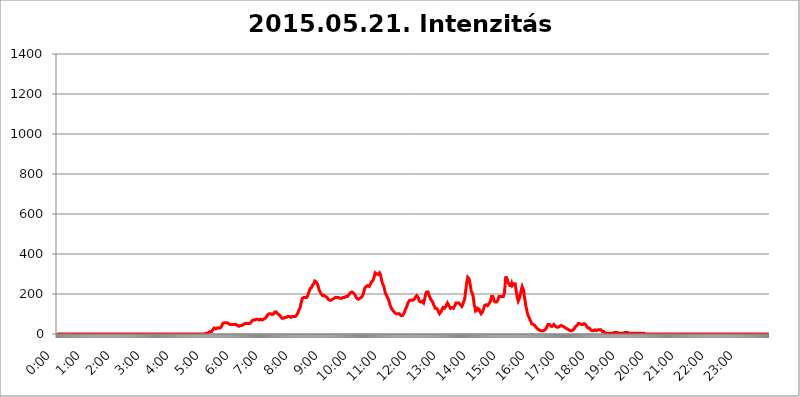
| Category | 2015.05.21. Intenzitás [W/m^2] |
|---|---|
| 0.0 | 0 |
| 0.0006944444444444445 | 0 |
| 0.001388888888888889 | 0 |
| 0.0020833333333333333 | 0 |
| 0.002777777777777778 | 0 |
| 0.003472222222222222 | 0 |
| 0.004166666666666667 | 0 |
| 0.004861111111111111 | 0 |
| 0.005555555555555556 | 0 |
| 0.0062499999999999995 | 0 |
| 0.006944444444444444 | 0 |
| 0.007638888888888889 | 0 |
| 0.008333333333333333 | 0 |
| 0.009027777777777779 | 0 |
| 0.009722222222222222 | 0 |
| 0.010416666666666666 | 0 |
| 0.011111111111111112 | 0 |
| 0.011805555555555555 | 0 |
| 0.012499999999999999 | 0 |
| 0.013194444444444444 | 0 |
| 0.013888888888888888 | 0 |
| 0.014583333333333332 | 0 |
| 0.015277777777777777 | 0 |
| 0.015972222222222224 | 0 |
| 0.016666666666666666 | 0 |
| 0.017361111111111112 | 0 |
| 0.018055555555555557 | 0 |
| 0.01875 | 0 |
| 0.019444444444444445 | 0 |
| 0.02013888888888889 | 0 |
| 0.020833333333333332 | 0 |
| 0.02152777777777778 | 0 |
| 0.022222222222222223 | 0 |
| 0.02291666666666667 | 0 |
| 0.02361111111111111 | 0 |
| 0.024305555555555556 | 0 |
| 0.024999999999999998 | 0 |
| 0.025694444444444447 | 0 |
| 0.02638888888888889 | 0 |
| 0.027083333333333334 | 0 |
| 0.027777777777777776 | 0 |
| 0.02847222222222222 | 0 |
| 0.029166666666666664 | 0 |
| 0.029861111111111113 | 0 |
| 0.030555555555555555 | 0 |
| 0.03125 | 0 |
| 0.03194444444444445 | 0 |
| 0.03263888888888889 | 0 |
| 0.03333333333333333 | 0 |
| 0.034027777777777775 | 0 |
| 0.034722222222222224 | 0 |
| 0.035416666666666666 | 0 |
| 0.036111111111111115 | 0 |
| 0.03680555555555556 | 0 |
| 0.0375 | 0 |
| 0.03819444444444444 | 0 |
| 0.03888888888888889 | 0 |
| 0.03958333333333333 | 0 |
| 0.04027777777777778 | 0 |
| 0.04097222222222222 | 0 |
| 0.041666666666666664 | 0 |
| 0.042361111111111106 | 0 |
| 0.04305555555555556 | 0 |
| 0.043750000000000004 | 0 |
| 0.044444444444444446 | 0 |
| 0.04513888888888889 | 0 |
| 0.04583333333333334 | 0 |
| 0.04652777777777778 | 0 |
| 0.04722222222222222 | 0 |
| 0.04791666666666666 | 0 |
| 0.04861111111111111 | 0 |
| 0.049305555555555554 | 0 |
| 0.049999999999999996 | 0 |
| 0.05069444444444445 | 0 |
| 0.051388888888888894 | 0 |
| 0.052083333333333336 | 0 |
| 0.05277777777777778 | 0 |
| 0.05347222222222222 | 0 |
| 0.05416666666666667 | 0 |
| 0.05486111111111111 | 0 |
| 0.05555555555555555 | 0 |
| 0.05625 | 0 |
| 0.05694444444444444 | 0 |
| 0.057638888888888885 | 0 |
| 0.05833333333333333 | 0 |
| 0.05902777777777778 | 0 |
| 0.059722222222222225 | 0 |
| 0.06041666666666667 | 0 |
| 0.061111111111111116 | 0 |
| 0.06180555555555556 | 0 |
| 0.0625 | 0 |
| 0.06319444444444444 | 0 |
| 0.06388888888888888 | 0 |
| 0.06458333333333334 | 0 |
| 0.06527777777777778 | 0 |
| 0.06597222222222222 | 0 |
| 0.06666666666666667 | 0 |
| 0.06736111111111111 | 0 |
| 0.06805555555555555 | 0 |
| 0.06874999999999999 | 0 |
| 0.06944444444444443 | 0 |
| 0.07013888888888889 | 0 |
| 0.07083333333333333 | 0 |
| 0.07152777777777779 | 0 |
| 0.07222222222222223 | 0 |
| 0.07291666666666667 | 0 |
| 0.07361111111111111 | 0 |
| 0.07430555555555556 | 0 |
| 0.075 | 0 |
| 0.07569444444444444 | 0 |
| 0.0763888888888889 | 0 |
| 0.07708333333333334 | 0 |
| 0.07777777777777778 | 0 |
| 0.07847222222222222 | 0 |
| 0.07916666666666666 | 0 |
| 0.0798611111111111 | 0 |
| 0.08055555555555556 | 0 |
| 0.08125 | 0 |
| 0.08194444444444444 | 0 |
| 0.08263888888888889 | 0 |
| 0.08333333333333333 | 0 |
| 0.08402777777777777 | 0 |
| 0.08472222222222221 | 0 |
| 0.08541666666666665 | 0 |
| 0.08611111111111112 | 0 |
| 0.08680555555555557 | 0 |
| 0.08750000000000001 | 0 |
| 0.08819444444444445 | 0 |
| 0.08888888888888889 | 0 |
| 0.08958333333333333 | 0 |
| 0.09027777777777778 | 0 |
| 0.09097222222222222 | 0 |
| 0.09166666666666667 | 0 |
| 0.09236111111111112 | 0 |
| 0.09305555555555556 | 0 |
| 0.09375 | 0 |
| 0.09444444444444444 | 0 |
| 0.09513888888888888 | 0 |
| 0.09583333333333333 | 0 |
| 0.09652777777777777 | 0 |
| 0.09722222222222222 | 0 |
| 0.09791666666666667 | 0 |
| 0.09861111111111111 | 0 |
| 0.09930555555555555 | 0 |
| 0.09999999999999999 | 0 |
| 0.10069444444444443 | 0 |
| 0.1013888888888889 | 0 |
| 0.10208333333333335 | 0 |
| 0.10277777777777779 | 0 |
| 0.10347222222222223 | 0 |
| 0.10416666666666667 | 0 |
| 0.10486111111111111 | 0 |
| 0.10555555555555556 | 0 |
| 0.10625 | 0 |
| 0.10694444444444444 | 0 |
| 0.1076388888888889 | 0 |
| 0.10833333333333334 | 0 |
| 0.10902777777777778 | 0 |
| 0.10972222222222222 | 0 |
| 0.1111111111111111 | 0 |
| 0.11180555555555556 | 0 |
| 0.11180555555555556 | 0 |
| 0.1125 | 0 |
| 0.11319444444444444 | 0 |
| 0.11388888888888889 | 0 |
| 0.11458333333333333 | 0 |
| 0.11527777777777777 | 0 |
| 0.11597222222222221 | 0 |
| 0.11666666666666665 | 0 |
| 0.1173611111111111 | 0 |
| 0.11805555555555557 | 0 |
| 0.11944444444444445 | 0 |
| 0.12013888888888889 | 0 |
| 0.12083333333333333 | 0 |
| 0.12152777777777778 | 0 |
| 0.12222222222222223 | 0 |
| 0.12291666666666667 | 0 |
| 0.12291666666666667 | 0 |
| 0.12361111111111112 | 0 |
| 0.12430555555555556 | 0 |
| 0.125 | 0 |
| 0.12569444444444444 | 0 |
| 0.12638888888888888 | 0 |
| 0.12708333333333333 | 0 |
| 0.16875 | 0 |
| 0.12847222222222224 | 0 |
| 0.12916666666666668 | 0 |
| 0.12986111111111112 | 0 |
| 0.13055555555555556 | 0 |
| 0.13125 | 0 |
| 0.13194444444444445 | 0 |
| 0.1326388888888889 | 0 |
| 0.13333333333333333 | 0 |
| 0.13402777777777777 | 0 |
| 0.13402777777777777 | 0 |
| 0.13472222222222222 | 0 |
| 0.13541666666666666 | 0 |
| 0.1361111111111111 | 0 |
| 0.13749999999999998 | 0 |
| 0.13819444444444443 | 0 |
| 0.1388888888888889 | 0 |
| 0.13958333333333334 | 0 |
| 0.14027777777777778 | 0 |
| 0.14097222222222222 | 0 |
| 0.14166666666666666 | 0 |
| 0.1423611111111111 | 0 |
| 0.14305555555555557 | 0 |
| 0.14375000000000002 | 0 |
| 0.14444444444444446 | 0 |
| 0.1451388888888889 | 0 |
| 0.1451388888888889 | 0 |
| 0.14652777777777778 | 0 |
| 0.14722222222222223 | 0 |
| 0.14791666666666667 | 0 |
| 0.1486111111111111 | 0 |
| 0.14930555555555555 | 0 |
| 0.15 | 0 |
| 0.15069444444444444 | 0 |
| 0.15138888888888888 | 0 |
| 0.15208333333333332 | 0 |
| 0.15277777777777776 | 0 |
| 0.15347222222222223 | 0 |
| 0.15416666666666667 | 0 |
| 0.15486111111111112 | 0 |
| 0.15555555555555556 | 0 |
| 0.15625 | 0 |
| 0.15694444444444444 | 0 |
| 0.15763888888888888 | 0 |
| 0.15833333333333333 | 0 |
| 0.15902777777777777 | 0 |
| 0.15972222222222224 | 0 |
| 0.16041666666666668 | 0 |
| 0.16111111111111112 | 0 |
| 0.16180555555555556 | 0 |
| 0.1625 | 0 |
| 0.16319444444444445 | 0 |
| 0.1638888888888889 | 0 |
| 0.16458333333333333 | 0 |
| 0.16527777777777777 | 0 |
| 0.16597222222222222 | 0 |
| 0.16666666666666666 | 0 |
| 0.1673611111111111 | 0 |
| 0.16805555555555554 | 0 |
| 0.16874999999999998 | 0 |
| 0.16944444444444443 | 0 |
| 0.17013888888888887 | 0 |
| 0.1708333333333333 | 0 |
| 0.17152777777777775 | 0 |
| 0.17222222222222225 | 0 |
| 0.1729166666666667 | 0 |
| 0.17361111111111113 | 0 |
| 0.17430555555555557 | 0 |
| 0.17500000000000002 | 0 |
| 0.17569444444444446 | 0 |
| 0.1763888888888889 | 0 |
| 0.17708333333333334 | 0 |
| 0.17777777777777778 | 0 |
| 0.17847222222222223 | 0 |
| 0.17916666666666667 | 0 |
| 0.1798611111111111 | 0 |
| 0.18055555555555555 | 0 |
| 0.18125 | 0 |
| 0.18194444444444444 | 0 |
| 0.1826388888888889 | 0 |
| 0.18333333333333335 | 0 |
| 0.1840277777777778 | 0 |
| 0.18472222222222223 | 0 |
| 0.18541666666666667 | 0 |
| 0.18611111111111112 | 0 |
| 0.18680555555555556 | 0 |
| 0.1875 | 0 |
| 0.18819444444444444 | 0 |
| 0.18888888888888888 | 0 |
| 0.18958333333333333 | 0 |
| 0.19027777777777777 | 0 |
| 0.1909722222222222 | 0 |
| 0.19166666666666665 | 0 |
| 0.19236111111111112 | 0 |
| 0.19305555555555554 | 0 |
| 0.19375 | 0 |
| 0.19444444444444445 | 0 |
| 0.1951388888888889 | 0 |
| 0.19583333333333333 | 0 |
| 0.19652777777777777 | 0 |
| 0.19722222222222222 | 0 |
| 0.19791666666666666 | 0 |
| 0.1986111111111111 | 0 |
| 0.19930555555555554 | 0 |
| 0.19999999999999998 | 0 |
| 0.20069444444444443 | 0 |
| 0.20138888888888887 | 0 |
| 0.2020833333333333 | 0 |
| 0.2027777777777778 | 0 |
| 0.2034722222222222 | 0 |
| 0.2041666666666667 | 0 |
| 0.20486111111111113 | 0 |
| 0.20555555555555557 | 0 |
| 0.20625000000000002 | 0 |
| 0.20694444444444446 | 0 |
| 0.2076388888888889 | 0 |
| 0.20833333333333334 | 3.525 |
| 0.20902777777777778 | 3.525 |
| 0.20972222222222223 | 3.525 |
| 0.21041666666666667 | 3.525 |
| 0.2111111111111111 | 3.525 |
| 0.21180555555555555 | 3.525 |
| 0.2125 | 7.887 |
| 0.21319444444444444 | 7.887 |
| 0.2138888888888889 | 7.887 |
| 0.21458333333333335 | 12.257 |
| 0.2152777777777778 | 12.257 |
| 0.21597222222222223 | 12.257 |
| 0.21666666666666667 | 12.257 |
| 0.21736111111111112 | 16.636 |
| 0.21805555555555556 | 21.024 |
| 0.21875 | 21.024 |
| 0.21944444444444444 | 25.419 |
| 0.22013888888888888 | 29.823 |
| 0.22083333333333333 | 29.823 |
| 0.22152777777777777 | 29.823 |
| 0.2222222222222222 | 25.419 |
| 0.22291666666666665 | 25.419 |
| 0.2236111111111111 | 25.419 |
| 0.22430555555555556 | 29.823 |
| 0.225 | 29.823 |
| 0.22569444444444445 | 29.823 |
| 0.2263888888888889 | 29.823 |
| 0.22708333333333333 | 29.823 |
| 0.22777777777777777 | 29.823 |
| 0.22847222222222222 | 29.823 |
| 0.22916666666666666 | 29.823 |
| 0.2298611111111111 | 34.234 |
| 0.23055555555555554 | 38.653 |
| 0.23124999999999998 | 43.079 |
| 0.23194444444444443 | 51.951 |
| 0.23263888888888887 | 56.398 |
| 0.2333333333333333 | 56.398 |
| 0.2340277777777778 | 56.398 |
| 0.2347222222222222 | 56.398 |
| 0.2354166666666667 | 56.398 |
| 0.23611111111111113 | 56.398 |
| 0.23680555555555557 | 60.85 |
| 0.23750000000000002 | 60.85 |
| 0.23819444444444446 | 56.398 |
| 0.2388888888888889 | 56.398 |
| 0.23958333333333334 | 56.398 |
| 0.24027777777777778 | 51.951 |
| 0.24097222222222223 | 47.511 |
| 0.24166666666666667 | 47.511 |
| 0.2423611111111111 | 47.511 |
| 0.24305555555555555 | 47.511 |
| 0.24375 | 47.511 |
| 0.24444444444444446 | 47.511 |
| 0.24513888888888888 | 47.511 |
| 0.24583333333333335 | 47.511 |
| 0.2465277777777778 | 47.511 |
| 0.24722222222222223 | 47.511 |
| 0.24791666666666667 | 47.511 |
| 0.24861111111111112 | 47.511 |
| 0.24930555555555556 | 47.511 |
| 0.25 | 47.511 |
| 0.25069444444444444 | 47.511 |
| 0.2513888888888889 | 47.511 |
| 0.2520833333333333 | 43.079 |
| 0.25277777777777777 | 43.079 |
| 0.2534722222222222 | 43.079 |
| 0.25416666666666665 | 43.079 |
| 0.2548611111111111 | 38.653 |
| 0.2555555555555556 | 38.653 |
| 0.25625000000000003 | 43.079 |
| 0.2569444444444445 | 43.079 |
| 0.2576388888888889 | 43.079 |
| 0.25833333333333336 | 43.079 |
| 0.2590277777777778 | 43.079 |
| 0.25972222222222224 | 47.511 |
| 0.2604166666666667 | 47.511 |
| 0.2611111111111111 | 47.511 |
| 0.26180555555555557 | 51.951 |
| 0.2625 | 51.951 |
| 0.26319444444444445 | 51.951 |
| 0.2638888888888889 | 51.951 |
| 0.26458333333333334 | 51.951 |
| 0.2652777777777778 | 51.951 |
| 0.2659722222222222 | 51.951 |
| 0.26666666666666666 | 51.951 |
| 0.2673611111111111 | 51.951 |
| 0.26805555555555555 | 51.951 |
| 0.26875 | 51.951 |
| 0.26944444444444443 | 51.951 |
| 0.2701388888888889 | 51.951 |
| 0.2708333333333333 | 56.398 |
| 0.27152777777777776 | 56.398 |
| 0.2722222222222222 | 60.85 |
| 0.27291666666666664 | 65.31 |
| 0.2736111111111111 | 69.775 |
| 0.2743055555555555 | 69.775 |
| 0.27499999999999997 | 69.775 |
| 0.27569444444444446 | 69.775 |
| 0.27638888888888885 | 69.775 |
| 0.27708333333333335 | 69.775 |
| 0.2777777777777778 | 69.775 |
| 0.27847222222222223 | 74.246 |
| 0.2791666666666667 | 74.246 |
| 0.2798611111111111 | 74.246 |
| 0.28055555555555556 | 74.246 |
| 0.28125 | 74.246 |
| 0.28194444444444444 | 69.775 |
| 0.2826388888888889 | 69.775 |
| 0.2833333333333333 | 69.775 |
| 0.28402777777777777 | 69.775 |
| 0.2847222222222222 | 69.775 |
| 0.28541666666666665 | 74.246 |
| 0.28611111111111115 | 74.246 |
| 0.28680555555555554 | 74.246 |
| 0.28750000000000003 | 69.775 |
| 0.2881944444444445 | 69.775 |
| 0.2888888888888889 | 69.775 |
| 0.28958333333333336 | 74.246 |
| 0.2902777777777778 | 74.246 |
| 0.29097222222222224 | 78.722 |
| 0.2916666666666667 | 78.722 |
| 0.2923611111111111 | 78.722 |
| 0.29305555555555557 | 83.205 |
| 0.29375 | 87.692 |
| 0.29444444444444445 | 92.184 |
| 0.2951388888888889 | 96.682 |
| 0.29583333333333334 | 101.184 |
| 0.2965277777777778 | 101.184 |
| 0.2972222222222222 | 101.184 |
| 0.29791666666666666 | 101.184 |
| 0.2986111111111111 | 101.184 |
| 0.29930555555555555 | 101.184 |
| 0.3 | 101.184 |
| 0.30069444444444443 | 96.682 |
| 0.3013888888888889 | 96.682 |
| 0.3020833333333333 | 96.682 |
| 0.30277777777777776 | 101.184 |
| 0.3034722222222222 | 101.184 |
| 0.30416666666666664 | 105.69 |
| 0.3048611111111111 | 110.201 |
| 0.3055555555555555 | 110.201 |
| 0.30624999999999997 | 110.201 |
| 0.3069444444444444 | 110.201 |
| 0.3076388888888889 | 110.201 |
| 0.30833333333333335 | 105.69 |
| 0.3090277777777778 | 101.184 |
| 0.30972222222222223 | 101.184 |
| 0.3104166666666667 | 96.682 |
| 0.3111111111111111 | 96.682 |
| 0.31180555555555556 | 92.184 |
| 0.3125 | 92.184 |
| 0.31319444444444444 | 87.692 |
| 0.3138888888888889 | 87.692 |
| 0.3145833333333333 | 83.205 |
| 0.31527777777777777 | 78.722 |
| 0.3159722222222222 | 78.722 |
| 0.31666666666666665 | 78.722 |
| 0.31736111111111115 | 78.722 |
| 0.31805555555555554 | 83.205 |
| 0.31875000000000003 | 83.205 |
| 0.3194444444444445 | 83.205 |
| 0.3201388888888889 | 83.205 |
| 0.32083333333333336 | 83.205 |
| 0.3215277777777778 | 83.205 |
| 0.32222222222222224 | 83.205 |
| 0.3229166666666667 | 83.205 |
| 0.3236111111111111 | 87.692 |
| 0.32430555555555557 | 87.692 |
| 0.325 | 87.692 |
| 0.32569444444444445 | 87.692 |
| 0.3263888888888889 | 87.692 |
| 0.32708333333333334 | 83.205 |
| 0.3277777777777778 | 83.205 |
| 0.3284722222222222 | 83.205 |
| 0.32916666666666666 | 87.692 |
| 0.3298611111111111 | 87.692 |
| 0.33055555555555555 | 87.692 |
| 0.33125 | 87.692 |
| 0.33194444444444443 | 87.692 |
| 0.3326388888888889 | 83.205 |
| 0.3333333333333333 | 87.692 |
| 0.3340277777777778 | 87.692 |
| 0.3347222222222222 | 92.184 |
| 0.3354166666666667 | 92.184 |
| 0.3361111111111111 | 96.682 |
| 0.3368055555555556 | 101.184 |
| 0.33749999999999997 | 105.69 |
| 0.33819444444444446 | 110.201 |
| 0.33888888888888885 | 119.235 |
| 0.33958333333333335 | 123.758 |
| 0.34027777777777773 | 128.284 |
| 0.34097222222222223 | 137.347 |
| 0.3416666666666666 | 150.964 |
| 0.3423611111111111 | 160.056 |
| 0.3430555555555555 | 169.156 |
| 0.34375 | 178.264 |
| 0.3444444444444445 | 182.82 |
| 0.3451388888888889 | 182.82 |
| 0.3458333333333334 | 182.82 |
| 0.34652777777777777 | 182.82 |
| 0.34722222222222227 | 182.82 |
| 0.34791666666666665 | 182.82 |
| 0.34861111111111115 | 182.82 |
| 0.34930555555555554 | 178.264 |
| 0.35000000000000003 | 182.82 |
| 0.3506944444444444 | 182.82 |
| 0.3513888888888889 | 191.937 |
| 0.3520833333333333 | 201.058 |
| 0.3527777777777778 | 205.62 |
| 0.3534722222222222 | 214.746 |
| 0.3541666666666667 | 219.309 |
| 0.3548611111111111 | 228.436 |
| 0.35555555555555557 | 228.436 |
| 0.35625 | 233 |
| 0.35694444444444445 | 233 |
| 0.3576388888888889 | 242.127 |
| 0.35833333333333334 | 242.127 |
| 0.3590277777777778 | 246.689 |
| 0.3597222222222222 | 251.251 |
| 0.36041666666666666 | 255.813 |
| 0.3611111111111111 | 264.932 |
| 0.36180555555555555 | 264.932 |
| 0.3625 | 264.932 |
| 0.36319444444444443 | 260.373 |
| 0.3638888888888889 | 260.373 |
| 0.3645833333333333 | 255.813 |
| 0.3652777777777778 | 246.689 |
| 0.3659722222222222 | 237.564 |
| 0.3666666666666667 | 228.436 |
| 0.3673611111111111 | 219.309 |
| 0.3680555555555556 | 214.746 |
| 0.36874999999999997 | 210.182 |
| 0.36944444444444446 | 205.62 |
| 0.37013888888888885 | 201.058 |
| 0.37083333333333335 | 196.497 |
| 0.37152777777777773 | 196.497 |
| 0.37222222222222223 | 191.937 |
| 0.3729166666666666 | 191.937 |
| 0.3736111111111111 | 191.937 |
| 0.3743055555555555 | 191.937 |
| 0.375 | 191.937 |
| 0.3756944444444445 | 187.378 |
| 0.3763888888888889 | 187.378 |
| 0.3770833333333334 | 187.378 |
| 0.37777777777777777 | 182.82 |
| 0.37847222222222227 | 182.82 |
| 0.37916666666666665 | 178.264 |
| 0.37986111111111115 | 173.709 |
| 0.38055555555555554 | 173.709 |
| 0.38125000000000003 | 173.709 |
| 0.3819444444444444 | 169.156 |
| 0.3826388888888889 | 169.156 |
| 0.3833333333333333 | 169.156 |
| 0.3840277777777778 | 169.156 |
| 0.3847222222222222 | 169.156 |
| 0.3854166666666667 | 173.709 |
| 0.3861111111111111 | 173.709 |
| 0.38680555555555557 | 173.709 |
| 0.3875 | 178.264 |
| 0.38819444444444445 | 178.264 |
| 0.3888888888888889 | 182.82 |
| 0.38958333333333334 | 182.82 |
| 0.3902777777777778 | 182.82 |
| 0.3909722222222222 | 182.82 |
| 0.39166666666666666 | 182.82 |
| 0.3923611111111111 | 182.82 |
| 0.39305555555555555 | 182.82 |
| 0.39375 | 182.82 |
| 0.39444444444444443 | 182.82 |
| 0.3951388888888889 | 178.264 |
| 0.3958333333333333 | 178.264 |
| 0.3965277777777778 | 178.264 |
| 0.3972222222222222 | 178.264 |
| 0.3979166666666667 | 178.264 |
| 0.3986111111111111 | 178.264 |
| 0.3993055555555556 | 182.82 |
| 0.39999999999999997 | 182.82 |
| 0.40069444444444446 | 182.82 |
| 0.40138888888888885 | 182.82 |
| 0.40208333333333335 | 182.82 |
| 0.40277777777777773 | 182.82 |
| 0.40347222222222223 | 182.82 |
| 0.4041666666666666 | 182.82 |
| 0.4048611111111111 | 187.378 |
| 0.4055555555555555 | 187.378 |
| 0.40625 | 187.378 |
| 0.4069444444444445 | 187.378 |
| 0.4076388888888889 | 187.378 |
| 0.4083333333333334 | 191.937 |
| 0.40902777777777777 | 196.497 |
| 0.40972222222222227 | 201.058 |
| 0.41041666666666665 | 201.058 |
| 0.41111111111111115 | 205.62 |
| 0.41180555555555554 | 210.182 |
| 0.41250000000000003 | 210.182 |
| 0.4131944444444444 | 210.182 |
| 0.4138888888888889 | 210.182 |
| 0.4145833333333333 | 210.182 |
| 0.4152777777777778 | 205.62 |
| 0.4159722222222222 | 201.058 |
| 0.4166666666666667 | 201.058 |
| 0.4173611111111111 | 196.497 |
| 0.41805555555555557 | 191.937 |
| 0.41875 | 187.378 |
| 0.41944444444444445 | 182.82 |
| 0.4201388888888889 | 178.264 |
| 0.42083333333333334 | 173.709 |
| 0.4215277777777778 | 173.709 |
| 0.4222222222222222 | 173.709 |
| 0.42291666666666666 | 173.709 |
| 0.4236111111111111 | 178.264 |
| 0.42430555555555555 | 178.264 |
| 0.425 | 178.264 |
| 0.42569444444444443 | 178.264 |
| 0.4263888888888889 | 182.82 |
| 0.4270833333333333 | 182.82 |
| 0.4277777777777778 | 187.378 |
| 0.4284722222222222 | 191.937 |
| 0.4291666666666667 | 201.058 |
| 0.4298611111111111 | 210.182 |
| 0.4305555555555556 | 219.309 |
| 0.43124999999999997 | 228.436 |
| 0.43194444444444446 | 228.436 |
| 0.43263888888888885 | 233 |
| 0.43333333333333335 | 237.564 |
| 0.43402777777777773 | 242.127 |
| 0.43472222222222223 | 242.127 |
| 0.4354166666666666 | 242.127 |
| 0.4361111111111111 | 242.127 |
| 0.4368055555555555 | 237.564 |
| 0.4375 | 237.564 |
| 0.4381944444444445 | 242.127 |
| 0.4388888888888889 | 242.127 |
| 0.4395833333333334 | 251.251 |
| 0.44027777777777777 | 260.373 |
| 0.44097222222222227 | 264.932 |
| 0.44166666666666665 | 264.932 |
| 0.44236111111111115 | 264.932 |
| 0.44305555555555554 | 264.932 |
| 0.44375000000000003 | 269.49 |
| 0.4444444444444444 | 283.156 |
| 0.4451388888888889 | 296.808 |
| 0.4458333333333333 | 305.898 |
| 0.4465277777777778 | 310.44 |
| 0.4472222222222222 | 305.898 |
| 0.4479166666666667 | 301.354 |
| 0.4486111111111111 | 296.808 |
| 0.44930555555555557 | 296.808 |
| 0.45 | 296.808 |
| 0.45069444444444445 | 301.354 |
| 0.4513888888888889 | 301.354 |
| 0.45208333333333334 | 305.898 |
| 0.4527777777777778 | 301.354 |
| 0.4534722222222222 | 296.808 |
| 0.45416666666666666 | 283.156 |
| 0.4548611111111111 | 269.49 |
| 0.45555555555555555 | 260.373 |
| 0.45625 | 251.251 |
| 0.45694444444444443 | 246.689 |
| 0.4576388888888889 | 242.127 |
| 0.4583333333333333 | 233 |
| 0.4590277777777778 | 223.873 |
| 0.4597222222222222 | 210.182 |
| 0.4604166666666667 | 205.62 |
| 0.4611111111111111 | 196.497 |
| 0.4618055555555556 | 191.937 |
| 0.46249999999999997 | 187.378 |
| 0.46319444444444446 | 182.82 |
| 0.46388888888888885 | 178.264 |
| 0.46458333333333335 | 173.709 |
| 0.46527777777777773 | 164.605 |
| 0.46597222222222223 | 155.509 |
| 0.4666666666666666 | 146.423 |
| 0.4673611111111111 | 141.884 |
| 0.4680555555555555 | 132.814 |
| 0.46875 | 128.284 |
| 0.4694444444444445 | 123.758 |
| 0.4701388888888889 | 123.758 |
| 0.4708333333333334 | 119.235 |
| 0.47152777777777777 | 114.716 |
| 0.47222222222222227 | 114.716 |
| 0.47291666666666665 | 110.201 |
| 0.47361111111111115 | 105.69 |
| 0.47430555555555554 | 101.184 |
| 0.47500000000000003 | 101.184 |
| 0.4756944444444444 | 101.184 |
| 0.4763888888888889 | 96.682 |
| 0.4770833333333333 | 101.184 |
| 0.4777777777777778 | 101.184 |
| 0.4784722222222222 | 101.184 |
| 0.4791666666666667 | 101.184 |
| 0.4798611111111111 | 101.184 |
| 0.48055555555555557 | 96.682 |
| 0.48125 | 96.682 |
| 0.48194444444444445 | 92.184 |
| 0.4826388888888889 | 92.184 |
| 0.48333333333333334 | 92.184 |
| 0.4840277777777778 | 92.184 |
| 0.4847222222222222 | 96.682 |
| 0.48541666666666666 | 96.682 |
| 0.4861111111111111 | 101.184 |
| 0.48680555555555555 | 105.69 |
| 0.4875 | 114.716 |
| 0.48819444444444443 | 119.235 |
| 0.4888888888888889 | 128.284 |
| 0.4895833333333333 | 132.814 |
| 0.4902777777777778 | 137.347 |
| 0.4909722222222222 | 146.423 |
| 0.4916666666666667 | 150.964 |
| 0.4923611111111111 | 160.056 |
| 0.4930555555555556 | 164.605 |
| 0.49374999999999997 | 164.605 |
| 0.49444444444444446 | 169.156 |
| 0.49513888888888885 | 169.156 |
| 0.49583333333333335 | 169.156 |
| 0.49652777777777773 | 169.156 |
| 0.49722222222222223 | 169.156 |
| 0.4979166666666666 | 169.156 |
| 0.4986111111111111 | 169.156 |
| 0.4993055555555555 | 173.709 |
| 0.5 | 173.709 |
| 0.5006944444444444 | 173.709 |
| 0.5013888888888889 | 178.264 |
| 0.5020833333333333 | 182.82 |
| 0.5027777777777778 | 187.378 |
| 0.5034722222222222 | 187.378 |
| 0.5041666666666667 | 191.937 |
| 0.5048611111111111 | 191.937 |
| 0.5055555555555555 | 187.378 |
| 0.50625 | 182.82 |
| 0.5069444444444444 | 173.709 |
| 0.5076388888888889 | 164.605 |
| 0.5083333333333333 | 160.056 |
| 0.5090277777777777 | 160.056 |
| 0.5097222222222222 | 160.056 |
| 0.5104166666666666 | 160.056 |
| 0.5111111111111112 | 160.056 |
| 0.5118055555555555 | 164.605 |
| 0.5125000000000001 | 164.605 |
| 0.5131944444444444 | 160.056 |
| 0.513888888888889 | 155.509 |
| 0.5145833333333333 | 160.056 |
| 0.5152777777777778 | 173.709 |
| 0.5159722222222222 | 187.378 |
| 0.5166666666666667 | 201.058 |
| 0.517361111111111 | 205.62 |
| 0.5180555555555556 | 210.182 |
| 0.5187499999999999 | 214.746 |
| 0.5194444444444445 | 210.182 |
| 0.5201388888888888 | 210.182 |
| 0.5208333333333334 | 201.058 |
| 0.5215277777777778 | 191.937 |
| 0.5222222222222223 | 191.937 |
| 0.5229166666666667 | 182.82 |
| 0.5236111111111111 | 173.709 |
| 0.5243055555555556 | 169.156 |
| 0.525 | 169.156 |
| 0.5256944444444445 | 164.605 |
| 0.5263888888888889 | 160.056 |
| 0.5270833333333333 | 155.509 |
| 0.5277777777777778 | 146.423 |
| 0.5284722222222222 | 141.884 |
| 0.5291666666666667 | 137.347 |
| 0.5298611111111111 | 128.284 |
| 0.5305555555555556 | 128.284 |
| 0.53125 | 128.284 |
| 0.5319444444444444 | 128.284 |
| 0.5326388888888889 | 128.284 |
| 0.5333333333333333 | 123.758 |
| 0.5340277777777778 | 119.235 |
| 0.5347222222222222 | 110.201 |
| 0.5354166666666667 | 105.69 |
| 0.5361111111111111 | 101.184 |
| 0.5368055555555555 | 101.184 |
| 0.5375 | 101.184 |
| 0.5381944444444444 | 110.201 |
| 0.5388888888888889 | 114.716 |
| 0.5395833333333333 | 123.758 |
| 0.5402777777777777 | 128.284 |
| 0.5409722222222222 | 132.814 |
| 0.5416666666666666 | 132.814 |
| 0.5423611111111112 | 132.814 |
| 0.5430555555555555 | 128.284 |
| 0.5437500000000001 | 128.284 |
| 0.5444444444444444 | 132.814 |
| 0.545138888888889 | 137.347 |
| 0.5458333333333333 | 146.423 |
| 0.5465277777777778 | 150.964 |
| 0.5472222222222222 | 155.509 |
| 0.5479166666666667 | 155.509 |
| 0.548611111111111 | 146.423 |
| 0.5493055555555556 | 141.884 |
| 0.5499999999999999 | 137.347 |
| 0.5506944444444445 | 132.814 |
| 0.5513888888888888 | 128.284 |
| 0.5520833333333334 | 128.284 |
| 0.5527777777777778 | 132.814 |
| 0.5534722222222223 | 132.814 |
| 0.5541666666666667 | 132.814 |
| 0.5548611111111111 | 132.814 |
| 0.5555555555555556 | 128.284 |
| 0.55625 | 132.814 |
| 0.5569444444444445 | 137.347 |
| 0.5576388888888889 | 141.884 |
| 0.5583333333333333 | 146.423 |
| 0.5590277777777778 | 155.509 |
| 0.5597222222222222 | 155.509 |
| 0.5604166666666667 | 155.509 |
| 0.5611111111111111 | 155.509 |
| 0.5618055555555556 | 155.509 |
| 0.5625 | 155.509 |
| 0.5631944444444444 | 155.509 |
| 0.5638888888888889 | 150.964 |
| 0.5645833333333333 | 150.964 |
| 0.5652777777777778 | 146.423 |
| 0.5659722222222222 | 141.884 |
| 0.5666666666666667 | 141.884 |
| 0.5673611111111111 | 137.347 |
| 0.5680555555555555 | 141.884 |
| 0.56875 | 146.423 |
| 0.5694444444444444 | 155.509 |
| 0.5701388888888889 | 160.056 |
| 0.5708333333333333 | 169.156 |
| 0.5715277777777777 | 178.264 |
| 0.5722222222222222 | 196.497 |
| 0.5729166666666666 | 219.309 |
| 0.5736111111111112 | 237.564 |
| 0.5743055555555555 | 255.813 |
| 0.5750000000000001 | 269.49 |
| 0.5756944444444444 | 283.156 |
| 0.576388888888889 | 287.709 |
| 0.5770833333333333 | 283.156 |
| 0.5777777777777778 | 274.047 |
| 0.5784722222222222 | 260.373 |
| 0.5791666666666667 | 246.689 |
| 0.579861111111111 | 233 |
| 0.5805555555555556 | 214.746 |
| 0.5812499999999999 | 210.182 |
| 0.5819444444444445 | 205.62 |
| 0.5826388888888888 | 196.497 |
| 0.5833333333333334 | 187.378 |
| 0.5840277777777778 | 169.156 |
| 0.5847222222222223 | 146.423 |
| 0.5854166666666667 | 141.884 |
| 0.5861111111111111 | 128.284 |
| 0.5868055555555556 | 114.716 |
| 0.5875 | 110.201 |
| 0.5881944444444445 | 110.201 |
| 0.5888888888888889 | 119.235 |
| 0.5895833333333333 | 128.284 |
| 0.5902777777777778 | 128.284 |
| 0.5909722222222222 | 128.284 |
| 0.5916666666666667 | 123.758 |
| 0.5923611111111111 | 119.235 |
| 0.5930555555555556 | 110.201 |
| 0.59375 | 105.69 |
| 0.5944444444444444 | 101.184 |
| 0.5951388888888889 | 101.184 |
| 0.5958333333333333 | 105.69 |
| 0.5965277777777778 | 110.201 |
| 0.5972222222222222 | 119.235 |
| 0.5979166666666667 | 123.758 |
| 0.5986111111111111 | 132.814 |
| 0.5993055555555555 | 141.884 |
| 0.6 | 146.423 |
| 0.6006944444444444 | 146.423 |
| 0.6013888888888889 | 146.423 |
| 0.6020833333333333 | 146.423 |
| 0.6027777777777777 | 141.884 |
| 0.6034722222222222 | 141.884 |
| 0.6041666666666666 | 146.423 |
| 0.6048611111111112 | 146.423 |
| 0.6055555555555555 | 150.964 |
| 0.6062500000000001 | 150.964 |
| 0.6069444444444444 | 155.509 |
| 0.607638888888889 | 164.605 |
| 0.6083333333333333 | 173.709 |
| 0.6090277777777778 | 187.378 |
| 0.6097222222222222 | 191.937 |
| 0.6104166666666667 | 191.937 |
| 0.611111111111111 | 187.378 |
| 0.6118055555555556 | 178.264 |
| 0.6124999999999999 | 169.156 |
| 0.6131944444444445 | 164.605 |
| 0.6138888888888888 | 160.056 |
| 0.6145833333333334 | 160.056 |
| 0.6152777777777778 | 160.056 |
| 0.6159722222222223 | 160.056 |
| 0.6166666666666667 | 160.056 |
| 0.6173611111111111 | 164.605 |
| 0.6180555555555556 | 169.156 |
| 0.61875 | 178.264 |
| 0.6194444444444445 | 187.378 |
| 0.6201388888888889 | 187.378 |
| 0.6208333333333333 | 187.378 |
| 0.6215277777777778 | 187.378 |
| 0.6222222222222222 | 182.82 |
| 0.6229166666666667 | 182.82 |
| 0.6236111111111111 | 187.378 |
| 0.6243055555555556 | 187.378 |
| 0.625 | 187.378 |
| 0.6256944444444444 | 187.378 |
| 0.6263888888888889 | 191.937 |
| 0.6270833333333333 | 205.62 |
| 0.6277777777777778 | 228.436 |
| 0.6284722222222222 | 264.932 |
| 0.6291666666666667 | 287.709 |
| 0.6298611111111111 | 292.259 |
| 0.6305555555555555 | 283.156 |
| 0.63125 | 269.49 |
| 0.6319444444444444 | 255.813 |
| 0.6326388888888889 | 251.251 |
| 0.6333333333333333 | 251.251 |
| 0.6340277777777777 | 251.251 |
| 0.6347222222222222 | 242.127 |
| 0.6354166666666666 | 237.564 |
| 0.6361111111111112 | 237.564 |
| 0.6368055555555555 | 242.127 |
| 0.6375000000000001 | 251.251 |
| 0.6381944444444444 | 242.127 |
| 0.638888888888889 | 237.564 |
| 0.6395833333333333 | 242.127 |
| 0.6402777777777778 | 251.251 |
| 0.6409722222222222 | 255.813 |
| 0.6416666666666667 | 255.813 |
| 0.642361111111111 | 251.251 |
| 0.6430555555555556 | 233 |
| 0.6437499999999999 | 214.746 |
| 0.6444444444444445 | 196.497 |
| 0.6451388888888888 | 182.82 |
| 0.6458333333333334 | 173.709 |
| 0.6465277777777778 | 164.605 |
| 0.6472222222222223 | 164.605 |
| 0.6479166666666667 | 169.156 |
| 0.6486111111111111 | 182.82 |
| 0.6493055555555556 | 196.497 |
| 0.65 | 205.62 |
| 0.6506944444444445 | 219.309 |
| 0.6513888888888889 | 223.873 |
| 0.6520833333333333 | 237.564 |
| 0.6527777777777778 | 237.564 |
| 0.6534722222222222 | 233 |
| 0.6541666666666667 | 219.309 |
| 0.6548611111111111 | 196.497 |
| 0.6555555555555556 | 178.264 |
| 0.65625 | 164.605 |
| 0.6569444444444444 | 146.423 |
| 0.6576388888888889 | 132.814 |
| 0.6583333333333333 | 123.758 |
| 0.6590277777777778 | 110.201 |
| 0.6597222222222222 | 101.184 |
| 0.6604166666666667 | 92.184 |
| 0.6611111111111111 | 87.692 |
| 0.6618055555555555 | 83.205 |
| 0.6625 | 78.722 |
| 0.6631944444444444 | 69.775 |
| 0.6638888888888889 | 65.31 |
| 0.6645833333333333 | 60.85 |
| 0.6652777777777777 | 51.951 |
| 0.6659722222222222 | 47.511 |
| 0.6666666666666666 | 47.511 |
| 0.6673611111111111 | 47.511 |
| 0.6680555555555556 | 43.079 |
| 0.6687500000000001 | 43.079 |
| 0.6694444444444444 | 43.079 |
| 0.6701388888888888 | 38.653 |
| 0.6708333333333334 | 38.653 |
| 0.6715277777777778 | 34.234 |
| 0.6722222222222222 | 29.823 |
| 0.6729166666666666 | 29.823 |
| 0.6736111111111112 | 25.419 |
| 0.6743055555555556 | 25.419 |
| 0.6749999999999999 | 21.024 |
| 0.6756944444444444 | 21.024 |
| 0.6763888888888889 | 21.024 |
| 0.6770833333333334 | 21.024 |
| 0.6777777777777777 | 16.636 |
| 0.6784722222222223 | 16.636 |
| 0.6791666666666667 | 16.636 |
| 0.6798611111111111 | 16.636 |
| 0.6805555555555555 | 16.636 |
| 0.68125 | 16.636 |
| 0.6819444444444445 | 16.636 |
| 0.6826388888888889 | 16.636 |
| 0.6833333333333332 | 16.636 |
| 0.6840277777777778 | 21.024 |
| 0.6847222222222222 | 21.024 |
| 0.6854166666666667 | 25.419 |
| 0.686111111111111 | 29.823 |
| 0.6868055555555556 | 38.653 |
| 0.6875 | 43.079 |
| 0.6881944444444444 | 47.511 |
| 0.688888888888889 | 47.511 |
| 0.6895833333333333 | 47.511 |
| 0.6902777777777778 | 47.511 |
| 0.6909722222222222 | 47.511 |
| 0.6916666666666668 | 43.079 |
| 0.6923611111111111 | 38.653 |
| 0.6930555555555555 | 38.653 |
| 0.69375 | 38.653 |
| 0.6944444444444445 | 38.653 |
| 0.6951388888888889 | 38.653 |
| 0.6958333333333333 | 43.079 |
| 0.6965277777777777 | 47.511 |
| 0.6972222222222223 | 43.079 |
| 0.6979166666666666 | 43.079 |
| 0.6986111111111111 | 38.653 |
| 0.6993055555555556 | 38.653 |
| 0.7000000000000001 | 34.234 |
| 0.7006944444444444 | 34.234 |
| 0.7013888888888888 | 34.234 |
| 0.7020833333333334 | 34.234 |
| 0.7027777777777778 | 34.234 |
| 0.7034722222222222 | 34.234 |
| 0.7041666666666666 | 38.653 |
| 0.7048611111111112 | 38.653 |
| 0.7055555555555556 | 38.653 |
| 0.7062499999999999 | 38.653 |
| 0.7069444444444444 | 43.079 |
| 0.7076388888888889 | 43.079 |
| 0.7083333333333334 | 38.653 |
| 0.7090277777777777 | 38.653 |
| 0.7097222222222223 | 38.653 |
| 0.7104166666666667 | 38.653 |
| 0.7111111111111111 | 34.234 |
| 0.7118055555555555 | 34.234 |
| 0.7125 | 29.823 |
| 0.7131944444444445 | 29.823 |
| 0.7138888888888889 | 29.823 |
| 0.7145833333333332 | 25.419 |
| 0.7152777777777778 | 25.419 |
| 0.7159722222222222 | 21.024 |
| 0.7166666666666667 | 21.024 |
| 0.717361111111111 | 21.024 |
| 0.7180555555555556 | 21.024 |
| 0.71875 | 16.636 |
| 0.7194444444444444 | 16.636 |
| 0.720138888888889 | 16.636 |
| 0.7208333333333333 | 16.636 |
| 0.7215277777777778 | 16.636 |
| 0.7222222222222222 | 16.636 |
| 0.7229166666666668 | 21.024 |
| 0.7236111111111111 | 21.024 |
| 0.7243055555555555 | 21.024 |
| 0.725 | 25.419 |
| 0.7256944444444445 | 29.823 |
| 0.7263888888888889 | 34.234 |
| 0.7270833333333333 | 38.653 |
| 0.7277777777777777 | 43.079 |
| 0.7284722222222223 | 43.079 |
| 0.7291666666666666 | 43.079 |
| 0.7298611111111111 | 47.511 |
| 0.7305555555555556 | 51.951 |
| 0.7312500000000001 | 51.951 |
| 0.7319444444444444 | 51.951 |
| 0.7326388888888888 | 51.951 |
| 0.7333333333333334 | 51.951 |
| 0.7340277777777778 | 47.511 |
| 0.7347222222222222 | 47.511 |
| 0.7354166666666666 | 47.511 |
| 0.7361111111111112 | 47.511 |
| 0.7368055555555556 | 47.511 |
| 0.7374999999999999 | 51.951 |
| 0.7381944444444444 | 51.951 |
| 0.7388888888888889 | 51.951 |
| 0.7395833333333334 | 51.951 |
| 0.7402777777777777 | 47.511 |
| 0.7409722222222223 | 47.511 |
| 0.7416666666666667 | 43.079 |
| 0.7423611111111111 | 38.653 |
| 0.7430555555555555 | 34.234 |
| 0.74375 | 34.234 |
| 0.7444444444444445 | 29.823 |
| 0.7451388888888889 | 34.234 |
| 0.7458333333333332 | 29.823 |
| 0.7465277777777778 | 29.823 |
| 0.7472222222222222 | 25.419 |
| 0.7479166666666667 | 21.024 |
| 0.748611111111111 | 21.024 |
| 0.7493055555555556 | 21.024 |
| 0.75 | 16.636 |
| 0.7506944444444444 | 16.636 |
| 0.751388888888889 | 16.636 |
| 0.7520833333333333 | 16.636 |
| 0.7527777777777778 | 16.636 |
| 0.7534722222222222 | 21.024 |
| 0.7541666666666668 | 21.024 |
| 0.7548611111111111 | 21.024 |
| 0.7555555555555555 | 16.636 |
| 0.75625 | 16.636 |
| 0.7569444444444445 | 16.636 |
| 0.7576388888888889 | 16.636 |
| 0.7583333333333333 | 21.024 |
| 0.7590277777777777 | 21.024 |
| 0.7597222222222223 | 21.024 |
| 0.7604166666666666 | 21.024 |
| 0.7611111111111111 | 21.024 |
| 0.7618055555555556 | 21.024 |
| 0.7625000000000001 | 21.024 |
| 0.7631944444444444 | 16.636 |
| 0.7638888888888888 | 16.636 |
| 0.7645833333333334 | 12.257 |
| 0.7652777777777778 | 12.257 |
| 0.7659722222222222 | 12.257 |
| 0.7666666666666666 | 12.257 |
| 0.7673611111111112 | 7.887 |
| 0.7680555555555556 | 7.887 |
| 0.7687499999999999 | 3.525 |
| 0.7694444444444444 | 3.525 |
| 0.7701388888888889 | 3.525 |
| 0.7708333333333334 | 3.525 |
| 0.7715277777777777 | 3.525 |
| 0.7722222222222223 | 3.525 |
| 0.7729166666666667 | 3.525 |
| 0.7736111111111111 | 3.525 |
| 0.7743055555555555 | 3.525 |
| 0.775 | 3.525 |
| 0.7756944444444445 | 3.525 |
| 0.7763888888888889 | 3.525 |
| 0.7770833333333332 | 3.525 |
| 0.7777777777777778 | 3.525 |
| 0.7784722222222222 | 3.525 |
| 0.7791666666666667 | 3.525 |
| 0.779861111111111 | 3.525 |
| 0.7805555555555556 | 7.887 |
| 0.78125 | 7.887 |
| 0.7819444444444444 | 7.887 |
| 0.782638888888889 | 7.887 |
| 0.7833333333333333 | 7.887 |
| 0.7840277777777778 | 7.887 |
| 0.7847222222222222 | 7.887 |
| 0.7854166666666668 | 7.887 |
| 0.7861111111111111 | 3.525 |
| 0.7868055555555555 | 3.525 |
| 0.7875 | 3.525 |
| 0.7881944444444445 | 3.525 |
| 0.7888888888888889 | 3.525 |
| 0.7895833333333333 | 3.525 |
| 0.7902777777777777 | 3.525 |
| 0.7909722222222223 | 3.525 |
| 0.7916666666666666 | 3.525 |
| 0.7923611111111111 | 3.525 |
| 0.7930555555555556 | 3.525 |
| 0.7937500000000001 | 3.525 |
| 0.7944444444444444 | 3.525 |
| 0.7951388888888888 | 3.525 |
| 0.7958333333333334 | 7.887 |
| 0.7965277777777778 | 7.887 |
| 0.7972222222222222 | 7.887 |
| 0.7979166666666666 | 7.887 |
| 0.7986111111111112 | 7.887 |
| 0.7993055555555556 | 7.887 |
| 0.7999999999999999 | 7.887 |
| 0.8006944444444444 | 7.887 |
| 0.8013888888888889 | 7.887 |
| 0.8020833333333334 | 3.525 |
| 0.8027777777777777 | 3.525 |
| 0.8034722222222223 | 3.525 |
| 0.8041666666666667 | 3.525 |
| 0.8048611111111111 | 3.525 |
| 0.8055555555555555 | 3.525 |
| 0.80625 | 3.525 |
| 0.8069444444444445 | 3.525 |
| 0.8076388888888889 | 3.525 |
| 0.8083333333333332 | 3.525 |
| 0.8090277777777778 | 3.525 |
| 0.8097222222222222 | 3.525 |
| 0.8104166666666667 | 3.525 |
| 0.811111111111111 | 3.525 |
| 0.8118055555555556 | 3.525 |
| 0.8125 | 3.525 |
| 0.8131944444444444 | 3.525 |
| 0.813888888888889 | 3.525 |
| 0.8145833333333333 | 3.525 |
| 0.8152777777777778 | 3.525 |
| 0.8159722222222222 | 3.525 |
| 0.8166666666666668 | 3.525 |
| 0.8173611111111111 | 3.525 |
| 0.8180555555555555 | 3.525 |
| 0.81875 | 3.525 |
| 0.8194444444444445 | 3.525 |
| 0.8201388888888889 | 3.525 |
| 0.8208333333333333 | 3.525 |
| 0.8215277777777777 | 0 |
| 0.8222222222222223 | 3.525 |
| 0.8229166666666666 | 3.525 |
| 0.8236111111111111 | 0 |
| 0.8243055555555556 | 0 |
| 0.8250000000000001 | 0 |
| 0.8256944444444444 | 0 |
| 0.8263888888888888 | 0 |
| 0.8270833333333334 | 0 |
| 0.8277777777777778 | 0 |
| 0.8284722222222222 | 0 |
| 0.8291666666666666 | 0 |
| 0.8298611111111112 | 0 |
| 0.8305555555555556 | 0 |
| 0.8312499999999999 | 0 |
| 0.8319444444444444 | 0 |
| 0.8326388888888889 | 0 |
| 0.8333333333333334 | 0 |
| 0.8340277777777777 | 0 |
| 0.8347222222222223 | 0 |
| 0.8354166666666667 | 0 |
| 0.8361111111111111 | 0 |
| 0.8368055555555555 | 0 |
| 0.8375 | 0 |
| 0.8381944444444445 | 0 |
| 0.8388888888888889 | 0 |
| 0.8395833333333332 | 0 |
| 0.8402777777777778 | 0 |
| 0.8409722222222222 | 0 |
| 0.8416666666666667 | 0 |
| 0.842361111111111 | 0 |
| 0.8430555555555556 | 0 |
| 0.84375 | 0 |
| 0.8444444444444444 | 0 |
| 0.845138888888889 | 0 |
| 0.8458333333333333 | 0 |
| 0.8465277777777778 | 0 |
| 0.8472222222222222 | 0 |
| 0.8479166666666668 | 0 |
| 0.8486111111111111 | 0 |
| 0.8493055555555555 | 0 |
| 0.85 | 0 |
| 0.8506944444444445 | 0 |
| 0.8513888888888889 | 0 |
| 0.8520833333333333 | 0 |
| 0.8527777777777777 | 0 |
| 0.8534722222222223 | 0 |
| 0.8541666666666666 | 0 |
| 0.8548611111111111 | 0 |
| 0.8555555555555556 | 0 |
| 0.8562500000000001 | 0 |
| 0.8569444444444444 | 0 |
| 0.8576388888888888 | 0 |
| 0.8583333333333334 | 0 |
| 0.8590277777777778 | 0 |
| 0.8597222222222222 | 0 |
| 0.8604166666666666 | 0 |
| 0.8611111111111112 | 0 |
| 0.8618055555555556 | 0 |
| 0.8624999999999999 | 0 |
| 0.8631944444444444 | 0 |
| 0.8638888888888889 | 0 |
| 0.8645833333333334 | 0 |
| 0.8652777777777777 | 0 |
| 0.8659722222222223 | 0 |
| 0.8666666666666667 | 0 |
| 0.8673611111111111 | 0 |
| 0.8680555555555555 | 0 |
| 0.86875 | 0 |
| 0.8694444444444445 | 0 |
| 0.8701388888888889 | 0 |
| 0.8708333333333332 | 0 |
| 0.8715277777777778 | 0 |
| 0.8722222222222222 | 0 |
| 0.8729166666666667 | 0 |
| 0.873611111111111 | 0 |
| 0.8743055555555556 | 0 |
| 0.875 | 0 |
| 0.8756944444444444 | 0 |
| 0.876388888888889 | 0 |
| 0.8770833333333333 | 0 |
| 0.8777777777777778 | 0 |
| 0.8784722222222222 | 0 |
| 0.8791666666666668 | 0 |
| 0.8798611111111111 | 0 |
| 0.8805555555555555 | 0 |
| 0.88125 | 0 |
| 0.8819444444444445 | 0 |
| 0.8826388888888889 | 0 |
| 0.8833333333333333 | 0 |
| 0.8840277777777777 | 0 |
| 0.8847222222222223 | 0 |
| 0.8854166666666666 | 0 |
| 0.8861111111111111 | 0 |
| 0.8868055555555556 | 0 |
| 0.8875000000000001 | 0 |
| 0.8881944444444444 | 0 |
| 0.8888888888888888 | 0 |
| 0.8895833333333334 | 0 |
| 0.8902777777777778 | 0 |
| 0.8909722222222222 | 0 |
| 0.8916666666666666 | 0 |
| 0.8923611111111112 | 0 |
| 0.8930555555555556 | 0 |
| 0.8937499999999999 | 0 |
| 0.8944444444444444 | 0 |
| 0.8951388888888889 | 0 |
| 0.8958333333333334 | 0 |
| 0.8965277777777777 | 0 |
| 0.8972222222222223 | 0 |
| 0.8979166666666667 | 0 |
| 0.8986111111111111 | 0 |
| 0.8993055555555555 | 0 |
| 0.9 | 0 |
| 0.9006944444444445 | 0 |
| 0.9013888888888889 | 0 |
| 0.9020833333333332 | 0 |
| 0.9027777777777778 | 0 |
| 0.9034722222222222 | 0 |
| 0.9041666666666667 | 0 |
| 0.904861111111111 | 0 |
| 0.9055555555555556 | 0 |
| 0.90625 | 0 |
| 0.9069444444444444 | 0 |
| 0.907638888888889 | 0 |
| 0.9083333333333333 | 0 |
| 0.9090277777777778 | 0 |
| 0.9097222222222222 | 0 |
| 0.9104166666666668 | 0 |
| 0.9111111111111111 | 0 |
| 0.9118055555555555 | 0 |
| 0.9125 | 0 |
| 0.9131944444444445 | 0 |
| 0.9138888888888889 | 0 |
| 0.9145833333333333 | 0 |
| 0.9152777777777777 | 0 |
| 0.9159722222222223 | 0 |
| 0.9166666666666666 | 0 |
| 0.9173611111111111 | 0 |
| 0.9180555555555556 | 0 |
| 0.9187500000000001 | 0 |
| 0.9194444444444444 | 0 |
| 0.9201388888888888 | 0 |
| 0.9208333333333334 | 0 |
| 0.9215277777777778 | 0 |
| 0.9222222222222222 | 0 |
| 0.9229166666666666 | 0 |
| 0.9236111111111112 | 0 |
| 0.9243055555555556 | 0 |
| 0.9249999999999999 | 0 |
| 0.9256944444444444 | 0 |
| 0.9263888888888889 | 0 |
| 0.9270833333333334 | 0 |
| 0.9277777777777777 | 0 |
| 0.9284722222222223 | 0 |
| 0.9291666666666667 | 0 |
| 0.9298611111111111 | 0 |
| 0.9305555555555555 | 0 |
| 0.93125 | 0 |
| 0.9319444444444445 | 0 |
| 0.9326388888888889 | 0 |
| 0.9333333333333332 | 0 |
| 0.9340277777777778 | 0 |
| 0.9347222222222222 | 0 |
| 0.9354166666666667 | 0 |
| 0.936111111111111 | 0 |
| 0.9368055555555556 | 0 |
| 0.9375 | 0 |
| 0.9381944444444444 | 0 |
| 0.938888888888889 | 0 |
| 0.9395833333333333 | 0 |
| 0.9402777777777778 | 0 |
| 0.9409722222222222 | 0 |
| 0.9416666666666668 | 0 |
| 0.9423611111111111 | 0 |
| 0.9430555555555555 | 0 |
| 0.94375 | 0 |
| 0.9444444444444445 | 0 |
| 0.9451388888888889 | 0 |
| 0.9458333333333333 | 0 |
| 0.9465277777777777 | 0 |
| 0.9472222222222223 | 0 |
| 0.9479166666666666 | 0 |
| 0.9486111111111111 | 0 |
| 0.9493055555555556 | 0 |
| 0.9500000000000001 | 0 |
| 0.9506944444444444 | 0 |
| 0.9513888888888888 | 0 |
| 0.9520833333333334 | 0 |
| 0.9527777777777778 | 0 |
| 0.9534722222222222 | 0 |
| 0.9541666666666666 | 0 |
| 0.9548611111111112 | 0 |
| 0.9555555555555556 | 0 |
| 0.9562499999999999 | 0 |
| 0.9569444444444444 | 0 |
| 0.9576388888888889 | 0 |
| 0.9583333333333334 | 0 |
| 0.9590277777777777 | 0 |
| 0.9597222222222223 | 0 |
| 0.9604166666666667 | 0 |
| 0.9611111111111111 | 0 |
| 0.9618055555555555 | 0 |
| 0.9625 | 0 |
| 0.9631944444444445 | 0 |
| 0.9638888888888889 | 0 |
| 0.9645833333333332 | 0 |
| 0.9652777777777778 | 0 |
| 0.9659722222222222 | 0 |
| 0.9666666666666667 | 0 |
| 0.967361111111111 | 0 |
| 0.9680555555555556 | 0 |
| 0.96875 | 0 |
| 0.9694444444444444 | 0 |
| 0.970138888888889 | 0 |
| 0.9708333333333333 | 0 |
| 0.9715277777777778 | 0 |
| 0.9722222222222222 | 0 |
| 0.9729166666666668 | 0 |
| 0.9736111111111111 | 0 |
| 0.9743055555555555 | 0 |
| 0.975 | 0 |
| 0.9756944444444445 | 0 |
| 0.9763888888888889 | 0 |
| 0.9770833333333333 | 0 |
| 0.9777777777777777 | 0 |
| 0.9784722222222223 | 0 |
| 0.9791666666666666 | 0 |
| 0.9798611111111111 | 0 |
| 0.9805555555555556 | 0 |
| 0.9812500000000001 | 0 |
| 0.9819444444444444 | 0 |
| 0.9826388888888888 | 0 |
| 0.9833333333333334 | 0 |
| 0.9840277777777778 | 0 |
| 0.9847222222222222 | 0 |
| 0.9854166666666666 | 0 |
| 0.9861111111111112 | 0 |
| 0.9868055555555556 | 0 |
| 0.9874999999999999 | 0 |
| 0.9881944444444444 | 0 |
| 0.9888888888888889 | 0 |
| 0.9895833333333334 | 0 |
| 0.9902777777777777 | 0 |
| 0.9909722222222223 | 0 |
| 0.9916666666666667 | 0 |
| 0.9923611111111111 | 0 |
| 0.9930555555555555 | 0 |
| 0.99375 | 0 |
| 0.9944444444444445 | 0 |
| 0.9951388888888889 | 0 |
| 0.9958333333333332 | 0 |
| 0.9965277777777778 | 0 |
| 0.9972222222222222 | 0 |
| 0.9979166666666667 | 0 |
| 0.998611111111111 | 0 |
| 0.9993055555555556 | 0 |